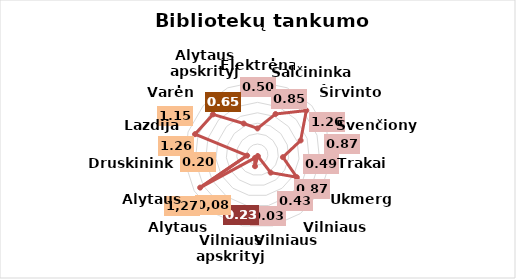
| Category | Series 0 |
|---|---|
| Elektrėnai | 0.5 |
| Šalčininkai | 0.85 |
| Širvintos | 1.26 |
| Švenčionys | 0.87 |
| Trakai | 0.49 |
| Ukmergė | 0.87 |
| Vilniaus r. | 0.43 |
| Vilniaus m. | 0.03 |
| Vilniaus apskrityje | 0.23 |
| Alytaus m. | 0.08 |
| Alytaus r. | 1.27 |
| Druskininkai | 0.2 |
| Lazdijai | 1.26 |
| Varėna | 1.15 |
| Alytaus apskrityje | 0.65 |